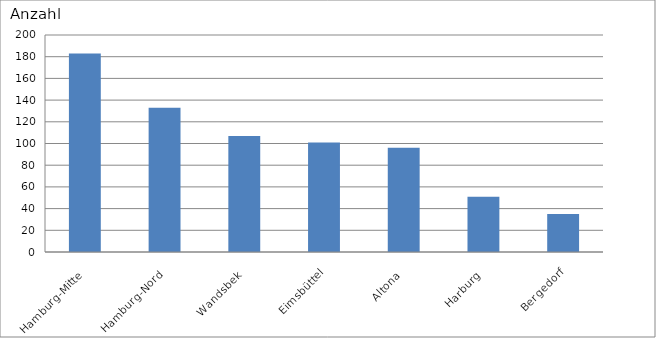
| Category | Hamburg-Mitte |
|---|---|
| Hamburg-Mitte | 183 |
| Hamburg-Nord | 133 |
| Wandsbek | 107 |
| Eimsbüttel | 101 |
| Altona | 96 |
| Harburg | 51 |
| Bergedorf | 35 |